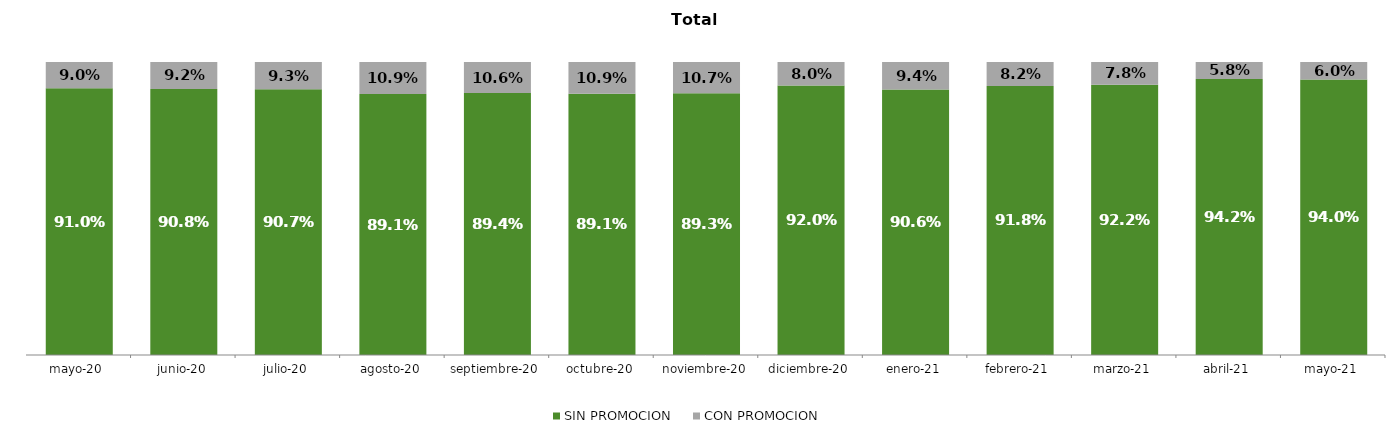
| Category | SIN PROMOCION   | CON PROMOCION   |
|---|---|---|
| 2020-05-01 | 0.91 | 0.09 |
| 2020-06-01 | 0.908 | 0.092 |
| 2020-07-01 | 0.907 | 0.093 |
| 2020-08-01 | 0.891 | 0.109 |
| 2020-09-01 | 0.894 | 0.106 |
| 2020-10-01 | 0.891 | 0.109 |
| 2020-11-01 | 0.893 | 0.107 |
| 2020-12-01 | 0.92 | 0.08 |
| 2021-01-01 | 0.906 | 0.094 |
| 2021-02-01 | 0.918 | 0.082 |
| 2021-03-01 | 0.922 | 0.078 |
| 2021-04-01 | 0.942 | 0.058 |
| 2021-05-01 | 0.94 | 0.06 |